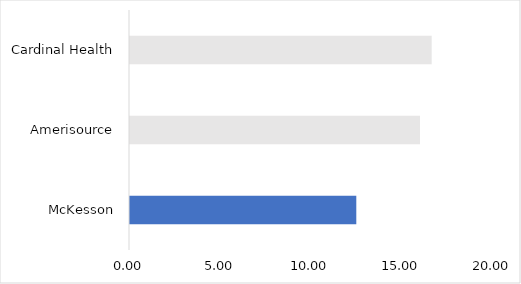
| Category | Series 0 |
|---|---|
| McKesson | 12.4 |
| Amerisource | 15.89 |
| Cardinal Health | 16.53 |